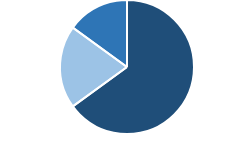
| Category | Growth |
|---|---|
| Car | 0.65 |
| Bus | 0.2 |
| Train | 0.15 |